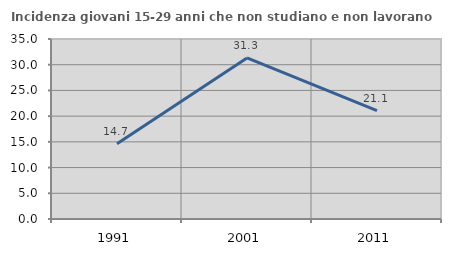
| Category | Incidenza giovani 15-29 anni che non studiano e non lavorano  |
|---|---|
| 1991.0 | 14.654 |
| 2001.0 | 31.316 |
| 2011.0 | 21.088 |